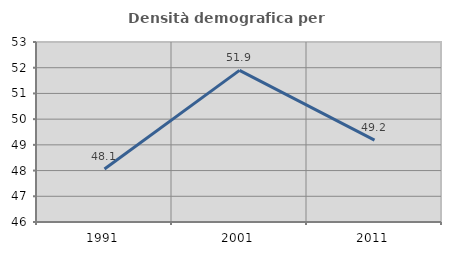
| Category | Densità demografica |
|---|---|
| 1991.0 | 48.061 |
| 2001.0 | 51.896 |
| 2011.0 | 49.186 |